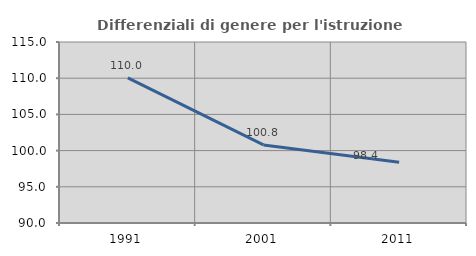
| Category | Differenziali di genere per l'istruzione superiore |
|---|---|
| 1991.0 | 110.044 |
| 2001.0 | 100.78 |
| 2011.0 | 98.403 |